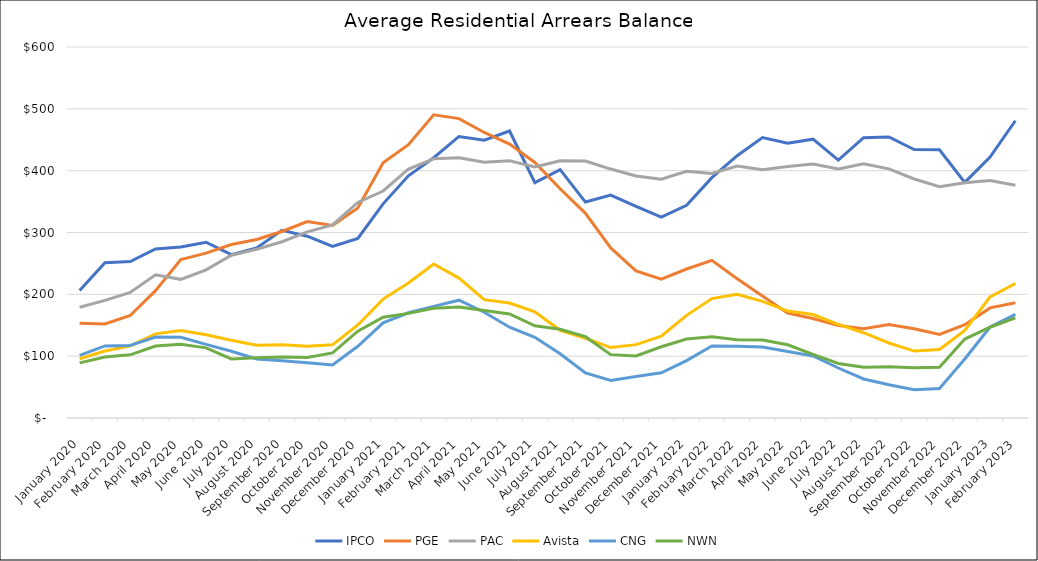
| Category | IPCO | PGE | PAC | Avista | CNG | NWN |
|---|---|---|---|---|---|---|
| 2020-01-01 | 206.082 | 153.16 | 179.031 | 95.802 | 101.271 | 89.091 |
| 2020-02-01 | 251.137 | 151.992 | 190.243 | 108.23 | 116.561 | 98.732 |
| 2020-03-01 | 252.964 | 165.748 | 203.108 | 116.572 | 117.204 | 102.115 |
| 2020-04-01 | 273.389 | 205.887 | 231.603 | 136.077 | 130.902 | 116.41 |
| 2020-05-01 | 276.608 | 256.11 | 224.235 | 141.396 | 130.518 | 119.158 |
| 2020-06-01 | 284.227 | 266.681 | 239.588 | 134.562 | 119.007 | 113.444 |
| 2020-07-01 | 264.126 | 280.55 | 263.216 | 125.724 | 107.955 | 95.581 |
| 2020-08-01 | 275.051 | 288.657 | 272.972 | 117.707 | 95.349 | 97.577 |
| 2020-09-01 | 303.583 | 301.676 | 285.014 | 118.488 | 92.692 | 98.796 |
| 2020-10-01 | 294.068 | 317.578 | 301.049 | 115.948 | 89.527 | 97.876 |
| 2020-11-01 | 277.35 | 311.532 | 312.297 | 118.3 | 85.914 | 105.185 |
| 2020-12-01 | 290.313 | 339.657 | 348.604 | 150.476 | 116.018 | 140.367 |
| 2021-01-01 | 346.311 | 412.932 | 367.129 | 192.326 | 153.839 | 163.01 |
| 2021-02-01 | 391.659 | 442 | 402.545 | 218.237 | 170.185 | 169.198 |
| 2021-03-01 | 420.926 | 490.446 | 419.129 | 249.075 | 180.492 | 177.539 |
| 2021-04-01 | 455.305 | 484.223 | 420.81 | 226.252 | 190.534 | 179.604 |
| 2021-05-01 | 449.333 | 461.766 | 413.492 | 191.416 | 171.08 | 173.792 |
| 2021-06-01 | 464.173 | 443.006 | 415.876 | 185.86 | 146.819 | 168.295 |
| 2021-07-01 | 380.685 | 413.297 | 405.958 | 171.867 | 130.441 | 149.144 |
| 2021-08-01 | 401.801 | 370.729 | 415.876 | 141.801 | 103.77 | 143.465 |
| 2021-09-01 | 349.239 | 331.003 | 415.622 | 128.976 | 72.88 | 131.525 |
| 2021-10-01 | 360.486 | 274.964 | 402.581 | 113.903 | 60.788 | 102.459 |
| 2021-11-01 | 342.174 | 237.801 | 391.443 | 118.646 | 67.247 | 100.361 |
| 2021-12-01 | 324.701 | 224.457 | 386.137 | 132.162 | 73.214 | 115.196 |
| 2022-01-01 | 343.991 | 240.92 | 399.125 | 165.979 | 92.9 | 127.667 |
| 2022-02-01 | 388.71 | 254.896 | 395.601 | 193.137 | 116.444 | 131.243 |
| 2022-03-01 | 424.221 | 225.133 | 407.48 | 199.975 | 115.945 | 126.564 |
| 2022-04-01 | 453.658 | 197.143 | 401.611 | 188.535 | 114.916 | 126.24 |
| 2022-05-01 | 444.473 | 169.565 | 406.85 | 172.874 | 107.64 | 118.483 |
| 2022-06-01 | 450.917 | 160.924 | 410.721 | 167.275 | 100.396 | 102.96 |
| 2022-07-01 | 417.025 | 149.415 | 402.859 | 151.286 | 80.848 | 88.133 |
| 2022-08-01 | 453.266 | 144.496 | 410.946 | 137.904 | 63.156 | 81.94 |
| 2022-09-01 | 454.407 | 151.025 | 402.859 | 121.322 | 53.843 | 82.932 |
| 2022-10-01 | 434.189 | 144.398 | 386.497 | 108.249 | 45.601 | 81.148 |
| 2022-11-01 | 433.821 | 135.288 | 373.956 | 110.745 | 47.699 | 81.966 |
| 2022-12-01 | 380.999 | 150.881 | 380.346 | 141.651 | 95.387 | 127.614 |
| 2023-01-01 | 421.97 | 178.057 | 384.202 | 196.014 | 147.185 | 146.78 |
| 2023-02-01 | 480.756 | 186.463 | 376.44 | 217.549 | 167.663 | 162 |